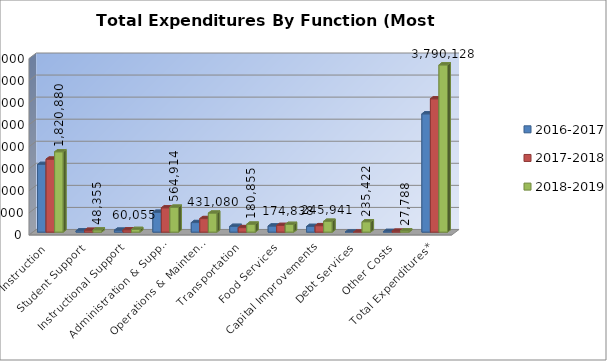
| Category | 2016-2017 | 2017-2018 | 2018-2019 |
|---|---|---|---|
| Instruction | 1533442 | 1653406 | 1820880 |
| Student Support | 28771 | 40478 | 48355 |
| Instructional Support | 43910 | 51152 | 60055 |
| Administration & Support | 448750 | 551389 | 564914 |
| Operations & Maintenance | 216034 | 306601 | 431080 |
| Transportation | 129797 | 102056 | 180855 |
| Food Services | 137766 | 150559 | 174838 |
| Capital Improvements | 128161 | 145941 | 245941 |
| Debt Services | 0 | 0 | 235422 |
| Other Costs | 14058 | 20446 | 27788 |
| Total Expenditures* | 2680689 | 3022028 | 3790128 |